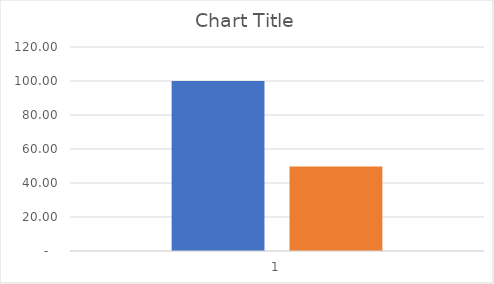
| Category | OR | cnbpK  |
|---|---|---|
| 0 | 100 | 49.724 |